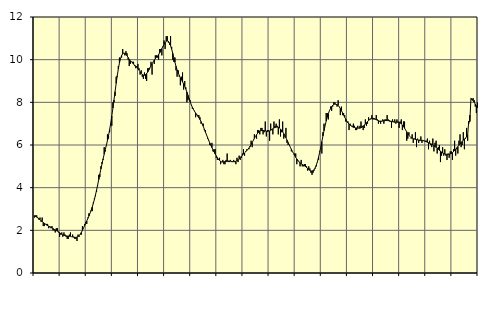
| Category | Piggar | Series 1 |
|---|---|---|
| nan | 2.6 | 2.69 |
| 87.0 | 2.7 | 2.65 |
| 87.0 | 2.7 | 2.62 |
| 87.0 | 2.6 | 2.58 |
| 87.0 | 2.5 | 2.54 |
| 87.0 | 2.6 | 2.5 |
| 87.0 | 2.4 | 2.45 |
| 87.0 | 2.6 | 2.41 |
| 87.0 | 2.2 | 2.37 |
| 87.0 | 2.2 | 2.33 |
| 87.0 | 2.3 | 2.29 |
| 87.0 | 2.3 | 2.25 |
| nan | 2.3 | 2.22 |
| 88.0 | 2.1 | 2.19 |
| 88.0 | 2.2 | 2.16 |
| 88.0 | 2.1 | 2.14 |
| 88.0 | 2.2 | 2.11 |
| 88.0 | 2 | 2.08 |
| 88.0 | 2 | 2.05 |
| 88.0 | 1.9 | 2.02 |
| 88.0 | 2.1 | 1.99 |
| 88.0 | 2.1 | 1.96 |
| 88.0 | 1.9 | 1.93 |
| 88.0 | 1.7 | 1.89 |
| nan | 1.8 | 1.85 |
| 89.0 | 1.9 | 1.82 |
| 89.0 | 1.7 | 1.79 |
| 89.0 | 1.9 | 1.77 |
| 89.0 | 1.8 | 1.75 |
| 89.0 | 1.7 | 1.74 |
| 89.0 | 1.6 | 1.73 |
| 89.0 | 1.6 | 1.73 |
| 89.0 | 1.8 | 1.72 |
| 89.0 | 1.9 | 1.72 |
| 89.0 | 1.7 | 1.7 |
| 89.0 | 1.8 | 1.69 |
| nan | 1.7 | 1.68 |
| 90.0 | 1.6 | 1.67 |
| 90.0 | 1.6 | 1.67 |
| 90.0 | 1.5 | 1.68 |
| 90.0 | 1.8 | 1.71 |
| 90.0 | 1.7 | 1.75 |
| 90.0 | 1.8 | 1.82 |
| 90.0 | 1.8 | 1.9 |
| 90.0 | 2.2 | 2 |
| 90.0 | 2.1 | 2.11 |
| 90.0 | 2.3 | 2.22 |
| 90.0 | 2.4 | 2.33 |
| nan | 2.3 | 2.44 |
| 91.0 | 2.6 | 2.56 |
| 91.0 | 2.8 | 2.67 |
| 91.0 | 2.8 | 2.8 |
| 91.0 | 2.9 | 2.94 |
| 91.0 | 2.9 | 3.09 |
| 91.0 | 3.3 | 3.26 |
| 91.0 | 3.5 | 3.45 |
| 91.0 | 3.6 | 3.66 |
| 91.0 | 3.8 | 3.89 |
| 91.0 | 4.1 | 4.13 |
| 91.0 | 4.6 | 4.38 |
| nan | 4.5 | 4.63 |
| 92.0 | 5 | 4.88 |
| 92.0 | 5.2 | 5.12 |
| 92.0 | 5.3 | 5.35 |
| 92.0 | 5.9 | 5.57 |
| 92.0 | 5.7 | 5.78 |
| 92.0 | 6 | 5.99 |
| 92.0 | 6.5 | 6.21 |
| 92.0 | 6.3 | 6.45 |
| 92.0 | 6.6 | 6.72 |
| 92.0 | 7 | 7.02 |
| 92.0 | 6.9 | 7.36 |
| nan | 8 | 7.73 |
| 93.0 | 8 | 8.11 |
| 93.0 | 8.3 | 8.5 |
| 93.0 | 9.2 | 8.89 |
| 93.0 | 9.2 | 9.25 |
| 93.0 | 9.7 | 9.57 |
| 93.0 | 10.1 | 9.84 |
| 93.0 | 10 | 10.05 |
| 93.0 | 10.1 | 10.19 |
| 93.0 | 10.5 | 10.28 |
| 93.0 | 10.3 | 10.31 |
| 93.0 | 10.2 | 10.29 |
| nan | 10.4 | 10.25 |
| 94.0 | 10.3 | 10.18 |
| 94.0 | 10 | 10.1 |
| 94.0 | 9.7 | 10.02 |
| 94.0 | 9.8 | 9.95 |
| 94.0 | 9.9 | 9.89 |
| 94.0 | 9.9 | 9.84 |
| 94.0 | 9.9 | 9.79 |
| 94.0 | 9.7 | 9.74 |
| 94.0 | 9.6 | 9.7 |
| 94.0 | 9.7 | 9.65 |
| 94.0 | 9.8 | 9.58 |
| nan | 9.6 | 9.51 |
| 95.0 | 9.3 | 9.43 |
| 95.0 | 9.5 | 9.36 |
| 95.0 | 9.2 | 9.31 |
| 95.0 | 9.1 | 9.28 |
| 95.0 | 9.4 | 9.27 |
| 95.0 | 9.1 | 9.3 |
| 95.0 | 9 | 9.35 |
| 95.0 | 9.6 | 9.42 |
| 95.0 | 9.6 | 9.51 |
| 95.0 | 9.6 | 9.62 |
| 95.0 | 9.9 | 9.72 |
| nan | 9.3 | 9.81 |
| 96.0 | 9.9 | 9.9 |
| 96.0 | 9.8 | 9.98 |
| 96.0 | 10.2 | 10.05 |
| 96.0 | 10.2 | 10.11 |
| 96.0 | 10.1 | 10.17 |
| 96.0 | 10 | 10.24 |
| 96.0 | 10.5 | 10.32 |
| 96.0 | 10.5 | 10.41 |
| 96.0 | 10.2 | 10.52 |
| 96.0 | 10.6 | 10.62 |
| 96.0 | 10.9 | 10.72 |
| nan | 10.5 | 10.81 |
| 97.0 | 11.1 | 10.86 |
| 97.0 | 11.1 | 10.88 |
| 97.0 | 10.8 | 10.86 |
| 97.0 | 10.7 | 10.78 |
| 97.0 | 11.1 | 10.66 |
| 97.0 | 10.6 | 10.49 |
| 97.0 | 10 | 10.3 |
| 97.0 | 9.9 | 10.09 |
| 97.0 | 10.1 | 9.88 |
| 97.0 | 9.5 | 9.69 |
| 97.0 | 9.2 | 9.52 |
| nan | 9.5 | 9.38 |
| 98.0 | 9.2 | 9.26 |
| 98.0 | 8.8 | 9.15 |
| 98.0 | 9.2 | 9.06 |
| 98.0 | 9.4 | 8.96 |
| 98.0 | 8.6 | 8.86 |
| 98.0 | 9 | 8.75 |
| 98.0 | 8.7 | 8.62 |
| 98.0 | 8 | 8.48 |
| 98.0 | 8.1 | 8.33 |
| 98.0 | 8.2 | 8.17 |
| 98.0 | 8.1 | 8.03 |
| nan | 7.9 | 7.89 |
| 99.0 | 7.7 | 7.77 |
| 99.0 | 7.7 | 7.67 |
| 99.0 | 7.6 | 7.58 |
| 99.0 | 7.3 | 7.5 |
| 99.0 | 7.4 | 7.43 |
| 99.0 | 7.4 | 7.35 |
| 99.0 | 7.4 | 7.28 |
| 99.0 | 7.3 | 7.19 |
| 99.0 | 7 | 7.1 |
| 99.0 | 7 | 6.99 |
| 99.0 | 7 | 6.88 |
| nan | 6.7 | 6.75 |
| 0.0 | 6.7 | 6.61 |
| 0.0 | 6.5 | 6.48 |
| 0.0 | 6.3 | 6.35 |
| 0.0 | 6.2 | 6.22 |
| 0.0 | 6 | 6.1 |
| 0.0 | 6 | 5.99 |
| 0.0 | 6.1 | 5.88 |
| 0.0 | 5.7 | 5.78 |
| 0.0 | 5.8 | 5.68 |
| 0.0 | 5.8 | 5.58 |
| 0.0 | 5.4 | 5.49 |
| nan | 5.3 | 5.41 |
| 1.0 | 5.3 | 5.33 |
| 1.0 | 5.4 | 5.28 |
| 1.0 | 5.1 | 5.23 |
| 1.0 | 5.2 | 5.21 |
| 1.0 | 5.3 | 5.2 |
| 1.0 | 5.1 | 5.21 |
| 1.0 | 5.1 | 5.22 |
| 1.0 | 5.3 | 5.23 |
| 1.0 | 5.6 | 5.24 |
| 1.0 | 5.2 | 5.25 |
| 1.0 | 5.2 | 5.25 |
| nan | 5.3 | 5.24 |
| 2.0 | 5.2 | 5.23 |
| 2.0 | 5.2 | 5.22 |
| 2.0 | 5.3 | 5.22 |
| 2.0 | 5.2 | 5.22 |
| 2.0 | 5.1 | 5.24 |
| 2.0 | 5.4 | 5.27 |
| 2.0 | 5.2 | 5.31 |
| 2.0 | 5.5 | 5.36 |
| 2.0 | 5.3 | 5.41 |
| 2.0 | 5.4 | 5.47 |
| 2.0 | 5.6 | 5.52 |
| nan | 5.8 | 5.57 |
| 3.0 | 5.5 | 5.63 |
| 3.0 | 5.7 | 5.68 |
| 3.0 | 5.8 | 5.74 |
| 3.0 | 5.8 | 5.8 |
| 3.0 | 5.8 | 5.86 |
| 3.0 | 5.9 | 5.94 |
| 3.0 | 6.2 | 6.02 |
| 3.0 | 5.9 | 6.12 |
| 3.0 | 6.2 | 6.21 |
| 3.0 | 6.5 | 6.31 |
| 3.0 | 6.4 | 6.4 |
| nan | 6.3 | 6.48 |
| 4.0 | 6.7 | 6.55 |
| 4.0 | 6.7 | 6.61 |
| 4.0 | 6.5 | 6.65 |
| 4.0 | 6.8 | 6.67 |
| 4.0 | 6.8 | 6.68 |
| 4.0 | 6.5 | 6.68 |
| 4.0 | 6.6 | 6.67 |
| 4.0 | 7.1 | 6.66 |
| 4.0 | 6.4 | 6.65 |
| 4.0 | 6.7 | 6.64 |
| 4.0 | 6.7 | 6.65 |
| nan | 6.2 | 6.66 |
| 5.0 | 7 | 6.69 |
| 5.0 | 6.7 | 6.73 |
| 5.0 | 6.5 | 6.76 |
| 5.0 | 7.1 | 6.8 |
| 5.0 | 6.9 | 6.82 |
| 5.0 | 7 | 6.84 |
| 5.0 | 6.9 | 6.84 |
| 5.0 | 6.5 | 6.83 |
| 5.0 | 7.2 | 6.8 |
| 5.0 | 6.4 | 6.75 |
| 5.0 | 6.6 | 6.69 |
| nan | 7.1 | 6.62 |
| 6.0 | 6.3 | 6.53 |
| 6.0 | 6.4 | 6.44 |
| 6.0 | 6.8 | 6.34 |
| 6.0 | 6.1 | 6.23 |
| 6.0 | 6 | 6.12 |
| 6.0 | 6 | 6.01 |
| 6.0 | 5.9 | 5.9 |
| 6.0 | 5.7 | 5.8 |
| 6.0 | 5.7 | 5.7 |
| 6.0 | 5.6 | 5.6 |
| 6.0 | 5.6 | 5.51 |
| nan | 5.6 | 5.42 |
| 7.0 | 5.1 | 5.35 |
| 7.0 | 5.3 | 5.27 |
| 7.0 | 5.2 | 5.21 |
| 7.0 | 5 | 5.16 |
| 7.0 | 5.3 | 5.12 |
| 7.0 | 5 | 5.09 |
| 7.0 | 5 | 5.06 |
| 7.0 | 5.1 | 5.02 |
| 7.0 | 5.1 | 4.99 |
| 7.0 | 5 | 4.94 |
| 7.0 | 4.8 | 4.9 |
| nan | 5 | 4.85 |
| 8.0 | 4.9 | 4.81 |
| 8.0 | 4.7 | 4.78 |
| 8.0 | 4.6 | 4.78 |
| 8.0 | 4.7 | 4.8 |
| 8.0 | 4.8 | 4.85 |
| 8.0 | 4.9 | 4.94 |
| 8.0 | 5 | 5.07 |
| 8.0 | 5.2 | 5.23 |
| 8.0 | 5.3 | 5.43 |
| 8.0 | 5.7 | 5.66 |
| 8.0 | 5.9 | 5.9 |
| nan | 5.6 | 6.16 |
| 9.0 | 6.6 | 6.42 |
| 9.0 | 7 | 6.67 |
| 9.0 | 6.9 | 6.91 |
| 9.0 | 7.5 | 7.12 |
| 9.0 | 7.5 | 7.31 |
| 9.0 | 7.2 | 7.47 |
| 9.0 | 7.6 | 7.61 |
| 9.0 | 7.8 | 7.71 |
| 9.0 | 7.6 | 7.8 |
| 9.0 | 7.8 | 7.86 |
| 9.0 | 8 | 7.9 |
| nan | 8 | 7.92 |
| 10.0 | 7.9 | 7.91 |
| 10.0 | 7.8 | 7.89 |
| 10.0 | 8.1 | 7.85 |
| 10.0 | 7.8 | 7.79 |
| 10.0 | 7.4 | 7.71 |
| 10.0 | 7.8 | 7.61 |
| 10.0 | 7.4 | 7.51 |
| 10.0 | 7.5 | 7.4 |
| 10.0 | 7.4 | 7.3 |
| 10.0 | 7.1 | 7.21 |
| 10.0 | 7.1 | 7.12 |
| nan | 7.1 | 7.04 |
| 11.0 | 6.7 | 6.98 |
| 11.0 | 7 | 6.93 |
| 11.0 | 6.9 | 6.89 |
| 11.0 | 6.9 | 6.86 |
| 11.0 | 7 | 6.83 |
| 11.0 | 6.9 | 6.82 |
| 11.0 | 6.7 | 6.8 |
| 11.0 | 6.7 | 6.8 |
| 11.0 | 6.9 | 6.79 |
| 11.0 | 6.8 | 6.79 |
| 11.0 | 6.9 | 6.79 |
| nan | 7.1 | 6.81 |
| 12.0 | 6.9 | 6.84 |
| 12.0 | 6.7 | 6.88 |
| 12.0 | 6.8 | 6.93 |
| 12.0 | 7.2 | 6.99 |
| 12.0 | 6.9 | 7.04 |
| 12.0 | 7 | 7.1 |
| 12.0 | 7.3 | 7.15 |
| 12.0 | 7.2 | 7.2 |
| 12.0 | 7.2 | 7.23 |
| 12.0 | 7.4 | 7.25 |
| 12.0 | 7.2 | 7.25 |
| nan | 7.2 | 7.24 |
| 13.0 | 7.2 | 7.22 |
| 13.0 | 7.4 | 7.19 |
| 13.0 | 7.2 | 7.16 |
| 13.0 | 7 | 7.14 |
| 13.0 | 7.1 | 7.12 |
| 13.0 | 7 | 7.12 |
| 13.0 | 7.1 | 7.12 |
| 13.0 | 7.2 | 7.13 |
| 13.0 | 7 | 7.14 |
| 13.0 | 7.2 | 7.14 |
| 13.0 | 7.2 | 7.15 |
| nan | 7.4 | 7.15 |
| 14.0 | 7.2 | 7.15 |
| 14.0 | 7.1 | 7.14 |
| 14.0 | 7.1 | 7.12 |
| 14.0 | 6.8 | 7.11 |
| 14.0 | 7.2 | 7.09 |
| 14.0 | 7.1 | 7.08 |
| 14.0 | 7.2 | 7.07 |
| 14.0 | 7 | 7.07 |
| 14.0 | 7.2 | 7.07 |
| 14.0 | 7.1 | 7.07 |
| 14.0 | 6.8 | 7.06 |
| nan | 7.1 | 7.03 |
| 15.0 | 7.2 | 6.99 |
| 15.0 | 6.7 | 6.94 |
| 15.0 | 7.1 | 6.87 |
| 15.0 | 7.1 | 6.79 |
| 15.0 | 6.7 | 6.7 |
| 15.0 | 6.2 | 6.62 |
| 15.0 | 6.3 | 6.53 |
| 15.0 | 6.6 | 6.46 |
| 15.0 | 6.4 | 6.4 |
| 15.0 | 6.3 | 6.35 |
| 15.0 | 6.5 | 6.32 |
| nan | 6.1 | 6.29 |
| 16.0 | 6.3 | 6.28 |
| 16.0 | 6.6 | 6.26 |
| 16.0 | 5.9 | 6.25 |
| 16.0 | 6.3 | 6.24 |
| 16.0 | 6.1 | 6.23 |
| 16.0 | 6.2 | 6.23 |
| 16.0 | 6.4 | 6.22 |
| 16.0 | 6.1 | 6.22 |
| 16.0 | 6.2 | 6.21 |
| 16.0 | 6.2 | 6.19 |
| 16.0 | 6.2 | 6.17 |
| nan | 6.2 | 6.15 |
| 17.0 | 6.3 | 6.13 |
| 17.0 | 5.8 | 6.11 |
| 17.0 | 6.2 | 6.08 |
| 17.0 | 6 | 6.06 |
| 17.0 | 5.9 | 6.04 |
| 17.0 | 6.3 | 6.01 |
| 17.0 | 5.7 | 5.97 |
| 17.0 | 6.1 | 5.93 |
| 17.0 | 6.2 | 5.89 |
| 17.0 | 5.6 | 5.84 |
| 17.0 | 5.9 | 5.8 |
| nan | 6 | 5.75 |
| 18.0 | 5.2 | 5.71 |
| 18.0 | 5.5 | 5.67 |
| 18.0 | 5.9 | 5.63 |
| 18.0 | 5.5 | 5.6 |
| 18.0 | 5.8 | 5.58 |
| 18.0 | 5.5 | 5.57 |
| 18.0 | 5.3 | 5.56 |
| 18.0 | 5.6 | 5.56 |
| 18.0 | 5.4 | 5.57 |
| 18.0 | 5.7 | 5.58 |
| 18.0 | 5.7 | 5.6 |
| nan | 5.3 | 5.64 |
| 19.0 | 5.8 | 5.69 |
| 19.0 | 6.2 | 5.74 |
| 19.0 | 5.5 | 5.8 |
| 19.0 | 5.8 | 5.87 |
| 19.0 | 5.6 | 5.93 |
| 19.0 | 6.2 | 5.99 |
| 19.0 | 6.5 | 6.05 |
| 19.0 | 5.9 | 6.11 |
| 19.0 | 6 | 6.17 |
| 19.0 | 6.6 | 6.23 |
| 19.0 | 5.8 | 6.28 |
| nan | 6.3 | 6.33 |
| 20.0 | 6.8 | 6.37 |
| 20.0 | 6.2 | 6.48 |
| 20.0 | 7 | 7.11 |
| 20.0 | 7.4 | 7.1 |
| 20.0 | 8.2 | 8.19 |
| 20.0 | 8.1 | 8.15 |
| 20.0 | 8.2 | 8.08 |
| 20.0 | 8.1 | 8 |
| 20.0 | 7.8 | 7.92 |
| 20.0 | 7.5 | 7.83 |
| 20.0 | 8 | 7.75 |